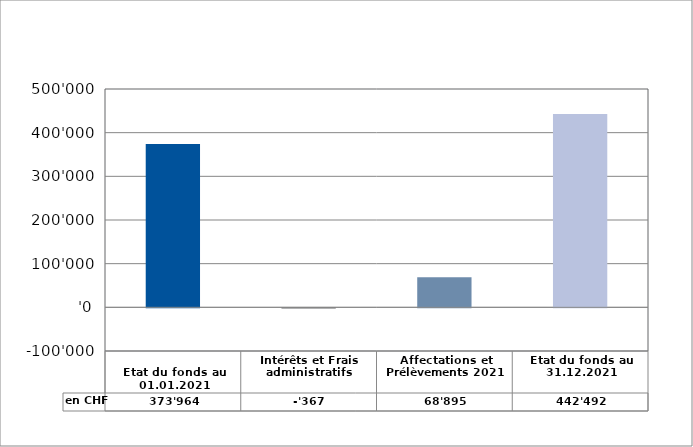
| Category | en CHF |
|---|---|
| 
Etat du fonds au 01.01.2021

 | 373964 |
| Intérêts et Frais administratifs | -367 |
| Affectations et Prélèvements 2021 | 68895 |
| Etat du fonds au 31.12.2021 | 442492 |